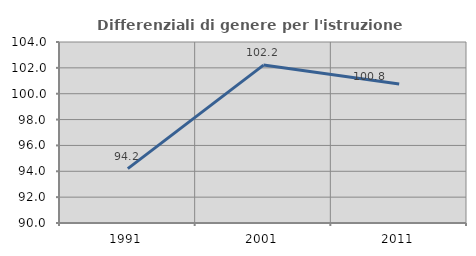
| Category | Differenziali di genere per l'istruzione superiore |
|---|---|
| 1991.0 | 94.207 |
| 2001.0 | 102.213 |
| 2011.0 | 100.755 |